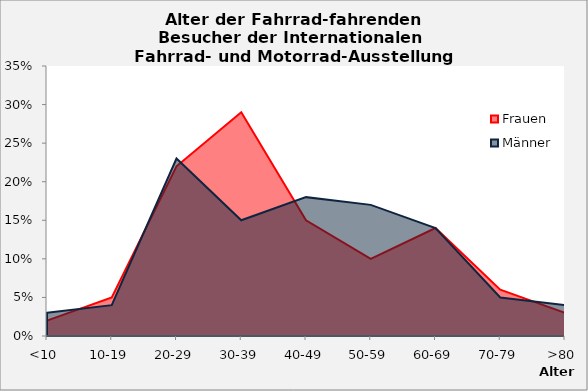
| Category | Frauen | Männer |
|---|---|---|
| <10 | 2 | 3 |
| 10-19 | 5 | 4 |
| 20-29 | 22 | 23 |
| 30-39 | 29 | 15 |
| 40-49 | 15 | 18 |
| 50-59 | 10 | 17 |
| 60-69 | 14 | 14 |
| 70-79 | 6 | 5 |
| >80 | 3 | 4 |